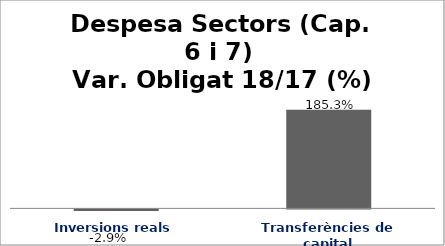
| Category | Series 0 |
|---|---|
| Inversions reals | -0.029 |
| Transferències de capital | 1.853 |